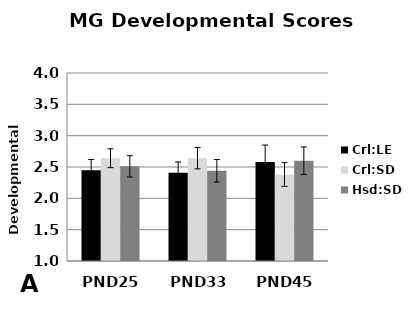
| Category | Crl:LE | Crl:SD | Hsd:SD |
|---|---|---|---|
| PND25 | 2.45 | 2.64 | 2.51 |
| PND33 | 2.41 | 2.64 | 2.44 |
| PND45 | 2.58 | 2.38 | 2.6 |